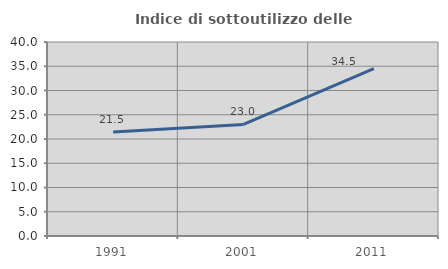
| Category | Indice di sottoutilizzo delle abitazioni  |
|---|---|
| 1991.0 | 21.465 |
| 2001.0 | 22.993 |
| 2011.0 | 34.5 |